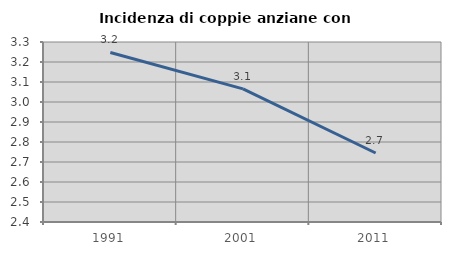
| Category | Incidenza di coppie anziane con figli |
|---|---|
| 1991.0 | 3.248 |
| 2001.0 | 3.066 |
| 2011.0 | 2.745 |